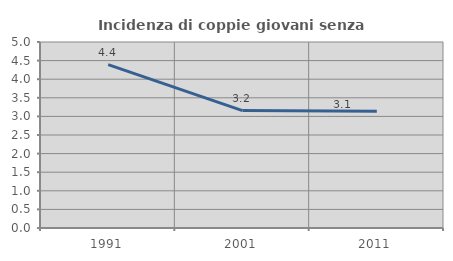
| Category | Incidenza di coppie giovani senza figli |
|---|---|
| 1991.0 | 4.392 |
| 2001.0 | 3.156 |
| 2011.0 | 3.138 |